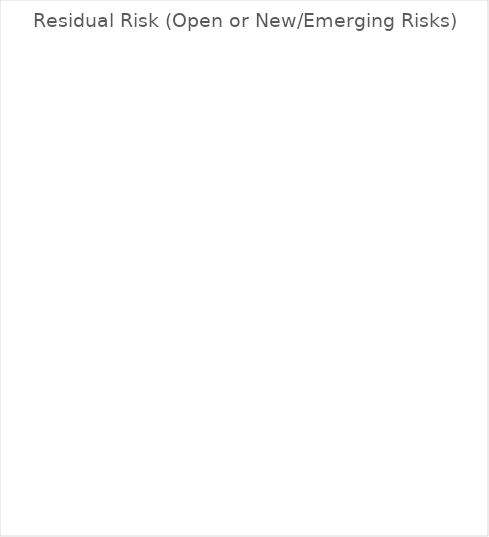
| Category | Residual Risks by Severity (Open or New/Emerging) |
|---|---|
| Minor | 0 |
| Moderate | 0 |
| Major | 0 |
| Severe | 0 |